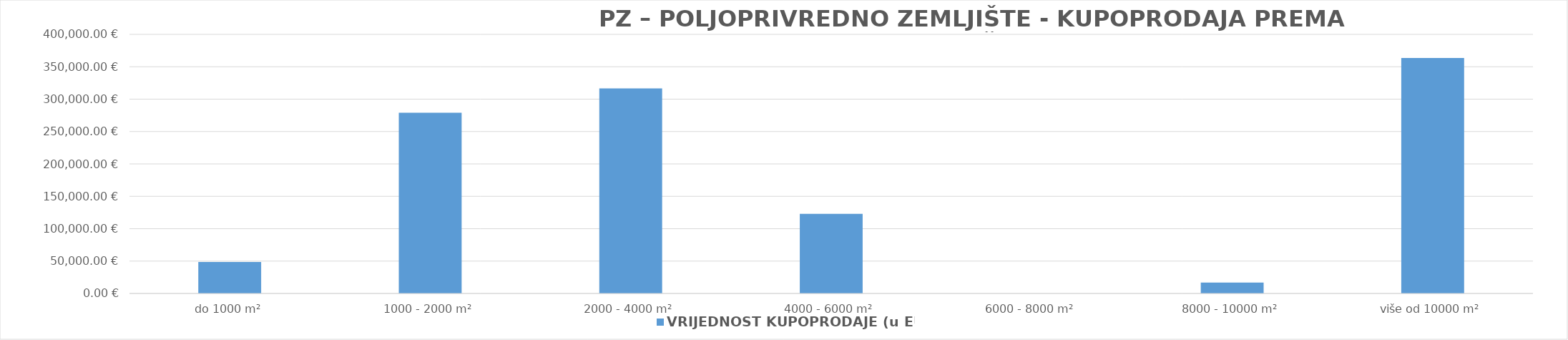
| Category | VRIJEDNOST KUPOPRODAJE (u EUR) |
|---|---|
| do 1000 m² | 48486.588 |
| 1000 - 2000 m² | 278896.949 |
| 2000 - 4000 m² | 316490.577 |
| 4000 - 6000 m² | 123027.311 |
| 6000 - 8000 m² | 0 |
| 8000 - 10000 m² | 16900.041 |
| više od 10000 m² | 363650.162 |